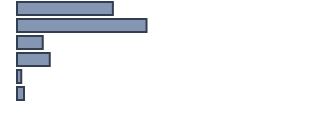
| Category | Series 0 |
|---|---|
| 0 | 32.5 |
| 1 | 43.9 |
| 2 | 8.7 |
| 3 | 11.1 |
| 4 | 1.4 |
| 5 | 2.4 |
| 6 | 0 |